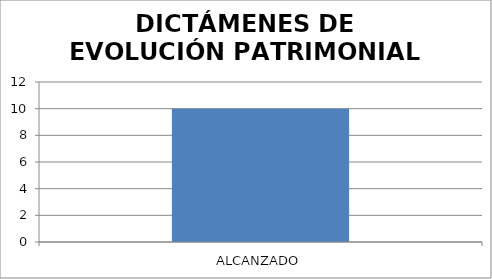
| Category | DICTAMENES DE EVOLUCIÓN PATRIMONIAL |
|---|---|
| ALCANZADO | 10 |